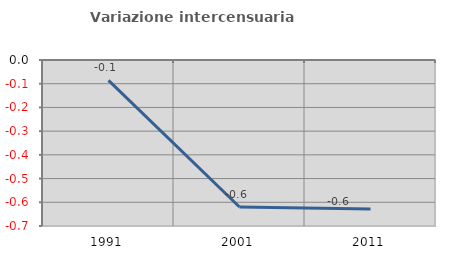
| Category | Variazione intercensuaria annua |
|---|---|
| 1991.0 | -0.086 |
| 2001.0 | -0.62 |
| 2011.0 | -0.628 |